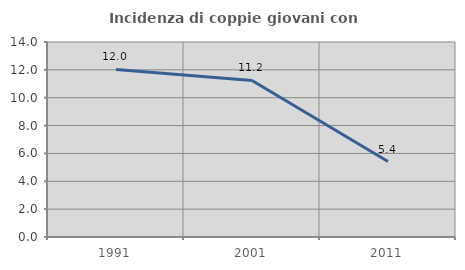
| Category | Incidenza di coppie giovani con figli |
|---|---|
| 1991.0 | 12.033 |
| 2001.0 | 11.236 |
| 2011.0 | 5.415 |